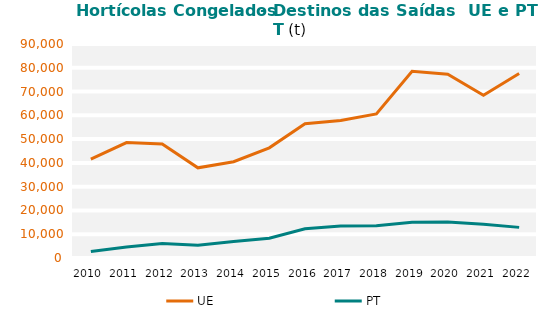
| Category | UE | PT |
|---|---|---|
| 2010.0 | 41583.083 | 2707.083 |
| 2011.0 | 48537.464 | 4665.299 |
| 2012.0 | 47952.564 | 6059.942 |
| 2013.0 | 37934.654 | 5338.372 |
| 2014.0 | 40473.862 | 6905.933 |
| 2015.0 | 46343.341 | 8332.995 |
| 2016.0 | 56446.988 | 12328.607 |
| 2017.0 | 57814.43 | 13441.895 |
| 2018.0 | 60562.764 | 13542 |
| 2019.0 | 78501.326 | 15009.287 |
| 2020.0 | 77318.413 | 15140.279 |
| 2021.0 | 68476.64 | 14241.416 |
| 2022.0 | 77607.194 | 12879.78 |